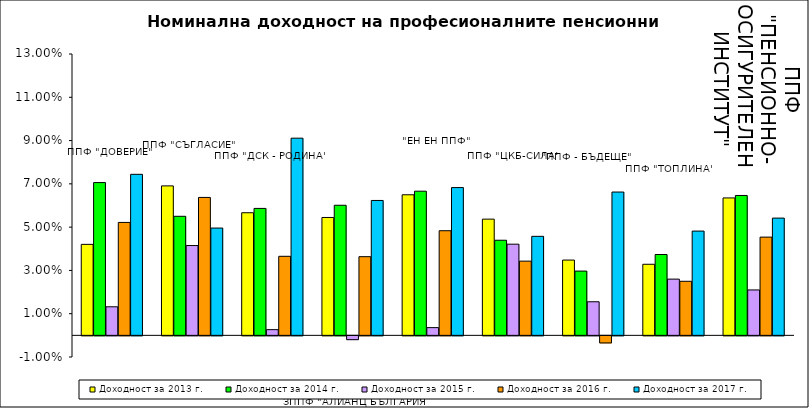
| Category | Доходност за 2013 г. | Доходност за 2014 г. | Доходност за 2015 г. | Доходност за 2016 г. | Доходност за 2017 г. |
|---|---|---|---|---|---|
| ППФ "ДОВЕРИЕ"  | 0.042 | 0.071 | 0.013 | 0.052 | 0.074 |
| ППФ "СЪГЛАСИЕ"  | 0.069 | 0.055 | 0.042 | 0.064 | 0.05 |
| ППФ "ДСК - РОДИНА" | 0.057 | 0.059 | 0.003 | 0.037 | 0.091 |
| ЗППФ "АЛИАНЦ БЪЛГАРИЯ" | 0.054 | 0.06 | -0.002 | 0.036 | 0.062 |
| "ЕН ЕН ППФ" | 0.065 | 0.067 | 0.004 | 0.048 | 0.068 |
| ППФ "ЦКБ-СИЛА" | 0.054 | 0.044 | 0.042 | 0.034 | 0.046 |
| "ППФ - БЪДЕЩЕ" | 0.035 | 0.03 | 0.016 | -0.003 | 0.066 |
| ППФ "ТОПЛИНА" | 0.033 | 0.037 | 0.026 | 0.025 | 0.048 |
| ППФ "ПЕНСИОННООСИГУРИТЕЛЕН ИНСТИТУТ" | 0.063 | 0.065 | 0.021 | 0.045 | 0.054 |